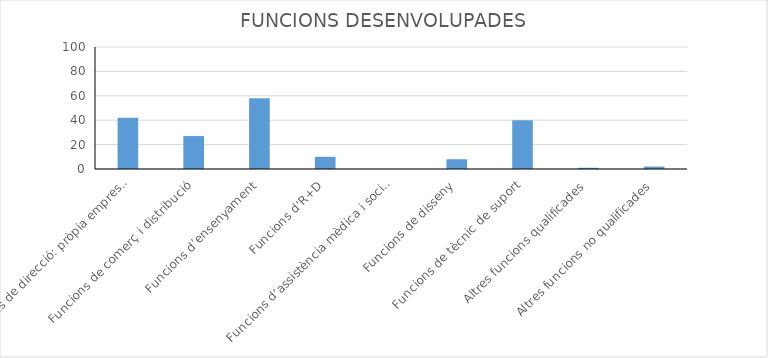
| Category | Series 0 |
|---|---|
| Funcions de direcció: pròpia empresa, direcció, producció, financera, etc. | 42 |
| Funcions de comerç i distribució | 27 |
| Funcions d’ensenyament | 58 |
| Funcions d’R+D | 10 |
| Funcions d’assistència mèdica i social | 0 |
| Funcions de disseny | 8 |
| Funcions de tècnic de suport | 40 |
| Altres funcions qualificades | 1 |
| Altres funcions no qualificades | 2 |